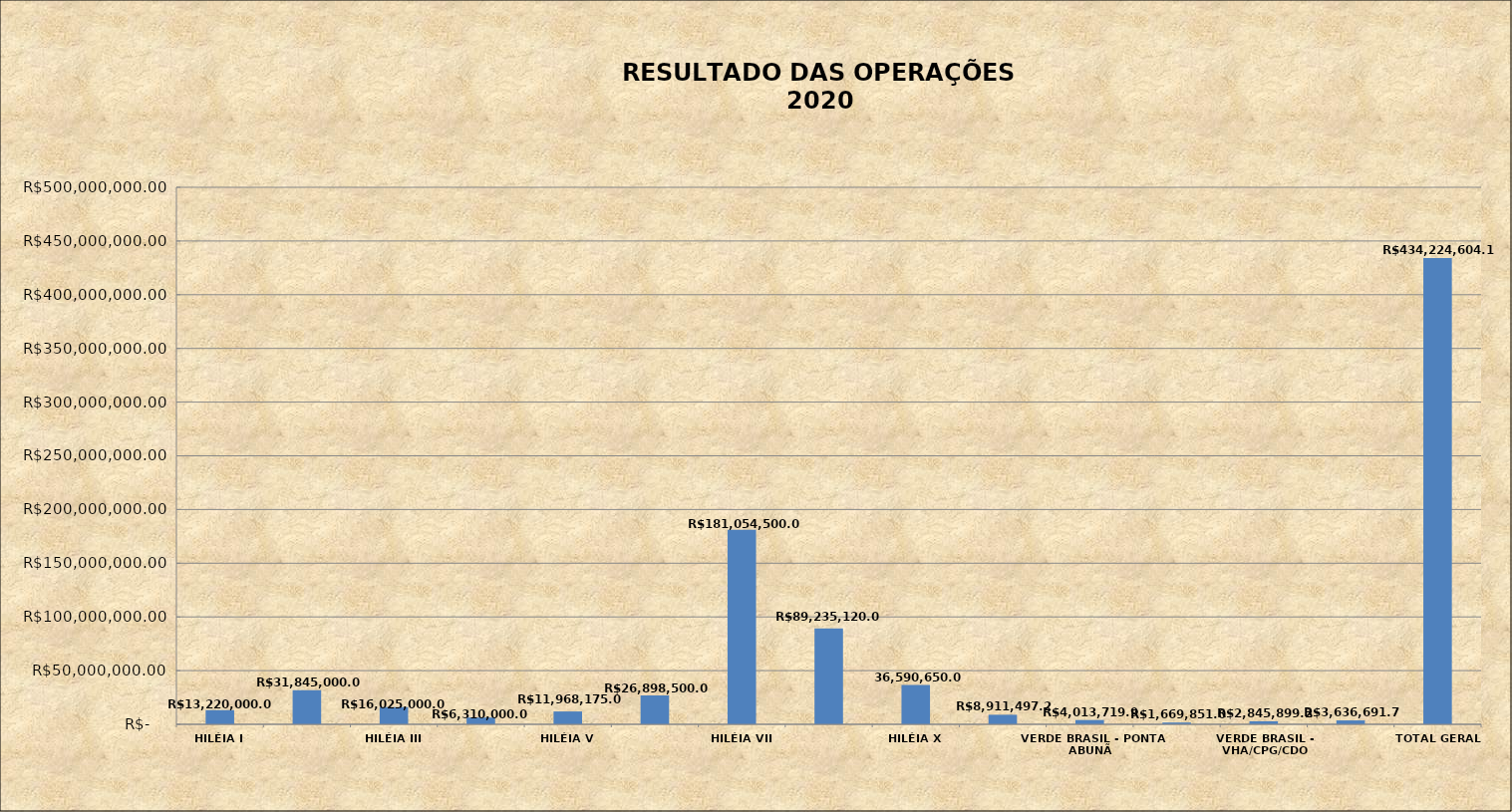
| Category | RESULTADO DAS OPERAÇÕES 2020 VALOR TOTAL |
|---|---|
| HILÉIA I | 13220000 |
| HILÉIA II | 31845000 |
| HILÉIA III | 16025000 |
| HILÉIA IV | 6310000 |
| HILÉIA V | 11968175 |
| HILÉIA VI | 26898500 |
| HILÉIA VII | 181054500 |
| HILÉIA VIII | 89235120 |
| HILÉIA X | 36590650 |
| VERDE BRASIL - SAMUEL | 8911497.26 |
| VERDE BRASIL - PONTA ABUNÃ | 4013719.92 |
| VERDE BRASIL - BURITIS/LINHA 45 | 1669851.03 |
| VERDE BRASIL - VHA/CPG/CDO | 2845899.21 |
| VERDE BRASIL - ALTO PARAÍSO | 3636691.75 |
| TOTAL GERAL | 434224604.17 |